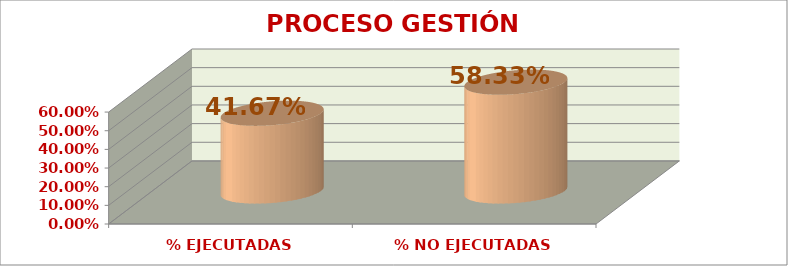
| Category | GESTIÓN ESTRATÉGICA |
|---|---|
| % EJECUTADAS | 0.417 |
| % NO EJECUTADAS | 0.583 |